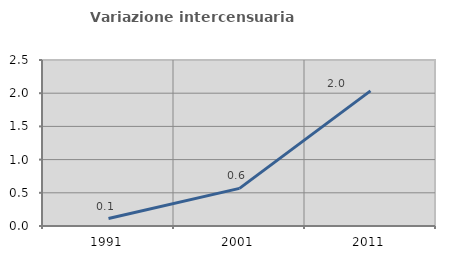
| Category | Variazione intercensuaria annua |
|---|---|
| 1991.0 | 0.112 |
| 2001.0 | 0.567 |
| 2011.0 | 2.035 |